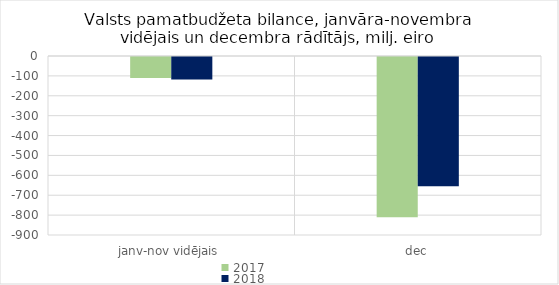
| Category | 2017 | 2018 |
|---|---|---|
| janv-nov vidējais | -105002.425 | -112720.799 |
| dec | -805850.118 | -649319.296 |